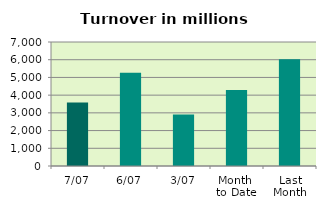
| Category | Series 0 |
|---|---|
| 7/07 | 3581.047 |
| 6/07 | 5259.152 |
| 3/07 | 2909.703 |
| Month 
to Date | 4283.838 |
| Last
Month | 6026.772 |